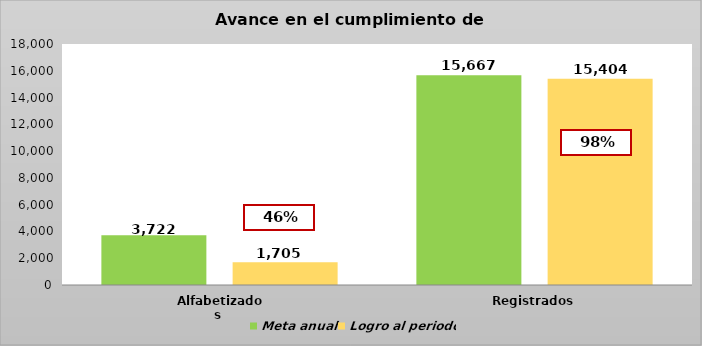
| Category | Meta anual | Logro al periodo |
|---|---|---|
| Alfabetizados  | 3722 | 1705 |
| Registrados | 15667 | 15404 |